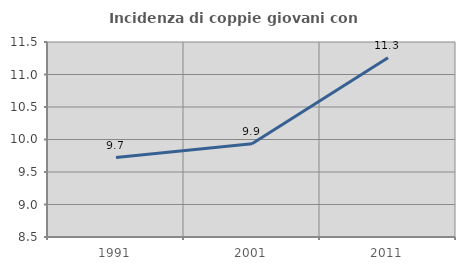
| Category | Incidenza di coppie giovani con figli |
|---|---|
| 1991.0 | 9.722 |
| 2001.0 | 9.934 |
| 2011.0 | 11.258 |